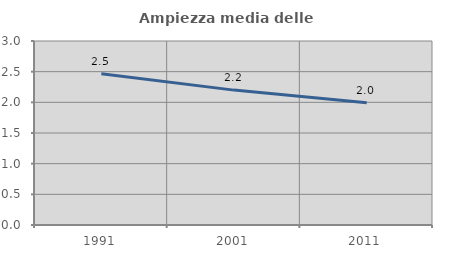
| Category | Ampiezza media delle famiglie |
|---|---|
| 1991.0 | 2.466 |
| 2001.0 | 2.199 |
| 2011.0 | 1.992 |